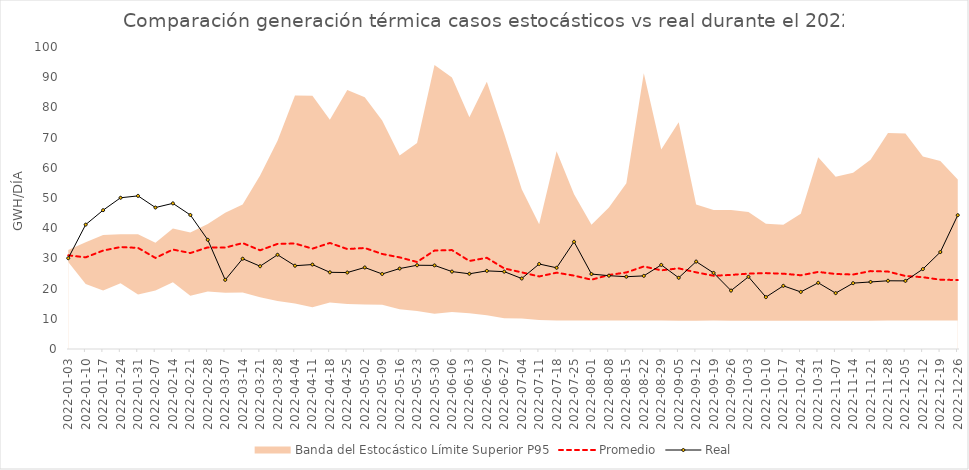
| Category | Promedio | Real |
|---|---|---|
| 2022-01-03 | 31.022 | 30.051 |
| 2022-01-10 | 30.347 | 41.188 |
| 2022-01-17 | 32.598 | 45.968 |
| 2022-01-24 | 33.758 | 50.075 |
| 2022-01-31 | 33.478 | 50.702 |
| 2022-02-07 | 30.158 | 46.839 |
| 2022-02-14 | 32.93 | 48.228 |
| 2022-02-21 | 31.771 | 44.38 |
| 2022-02-28 | 33.649 | 36.153 |
| 2022-03-07 | 33.572 | 22.887 |
| 2022-03-14 | 35.073 | 29.896 |
| 2022-03-21 | 32.685 | 27.411 |
| 2022-03-28 | 34.802 | 31.194 |
| 2022-04-04 | 34.93 | 27.575 |
| 2022-04-11 | 33.228 | 27.963 |
| 2022-04-18 | 35.112 | 25.388 |
| 2022-04-25 | 33.101 | 25.32 |
| 2022-05-02 | 33.446 | 26.99 |
| 2022-05-09 | 31.465 | 24.843 |
| 2022-05-16 | 30.343 | 26.631 |
| 2022-05-23 | 28.814 | 27.735 |
| 2022-05-30 | 32.601 | 27.682 |
| 2022-06-06 | 32.752 | 25.632 |
| 2022-06-13 | 29.147 | 24.902 |
| 2022-06-20 | 30.201 | 25.866 |
| 2022-06-27 | 26.672 | 25.616 |
| 2022-07-04 | 25.378 | 23.343 |
| 2022-07-11 | 24.021 | 28.145 |
| 2022-07-18 | 25.273 | 26.889 |
| 2022-07-25 | 24.298 | 35.507 |
| 2022-08-01 | 22.948 | 24.817 |
| 2022-08-08 | 24.51 | 24.278 |
| 2022-08-15 | 25.354 | 23.934 |
| 2022-08-22 | 27.334 | 24.213 |
| 2022-08-29 | 26.052 | 27.847 |
| 2022-09-05 | 26.7 | 23.584 |
| 2022-09-12 | 25.388 | 28.944 |
| 2022-09-19 | 24.258 | 25.2 |
| 2022-09-26 | 24.53 | 19.337 |
| 2022-10-03 | 24.951 | 23.911 |
| 2022-10-10 | 25.129 | 17.176 |
| 2022-10-17 | 24.937 | 20.915 |
| 2022-10-24 | 24.412 | 18.901 |
| 2022-10-31 | 25.521 | 21.921 |
| 2022-11-07 | 24.836 | 18.505 |
| 2022-11-14 | 24.666 | 21.808 |
| 2022-11-21 | 25.792 | 22.199 |
| 2022-11-28 | 25.644 | 22.591 |
| 2022-12-05 | 24.179 | 22.555 |
| 2022-12-12 | 23.775 | 26.464 |
| 2022-12-19 | 22.945 | 32.092 |
| 2022-12-26 | 22.843 | 44.299 |